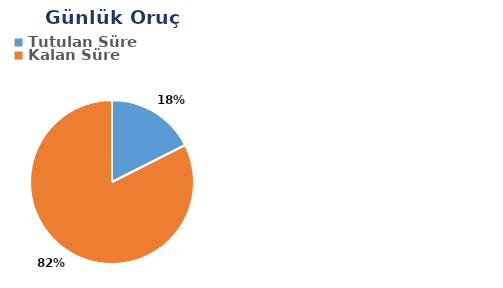
| Category | Günlük |
|---|---|
| Tutulan Süre | -0.157 |
| Kalan Süre | 0.739 |